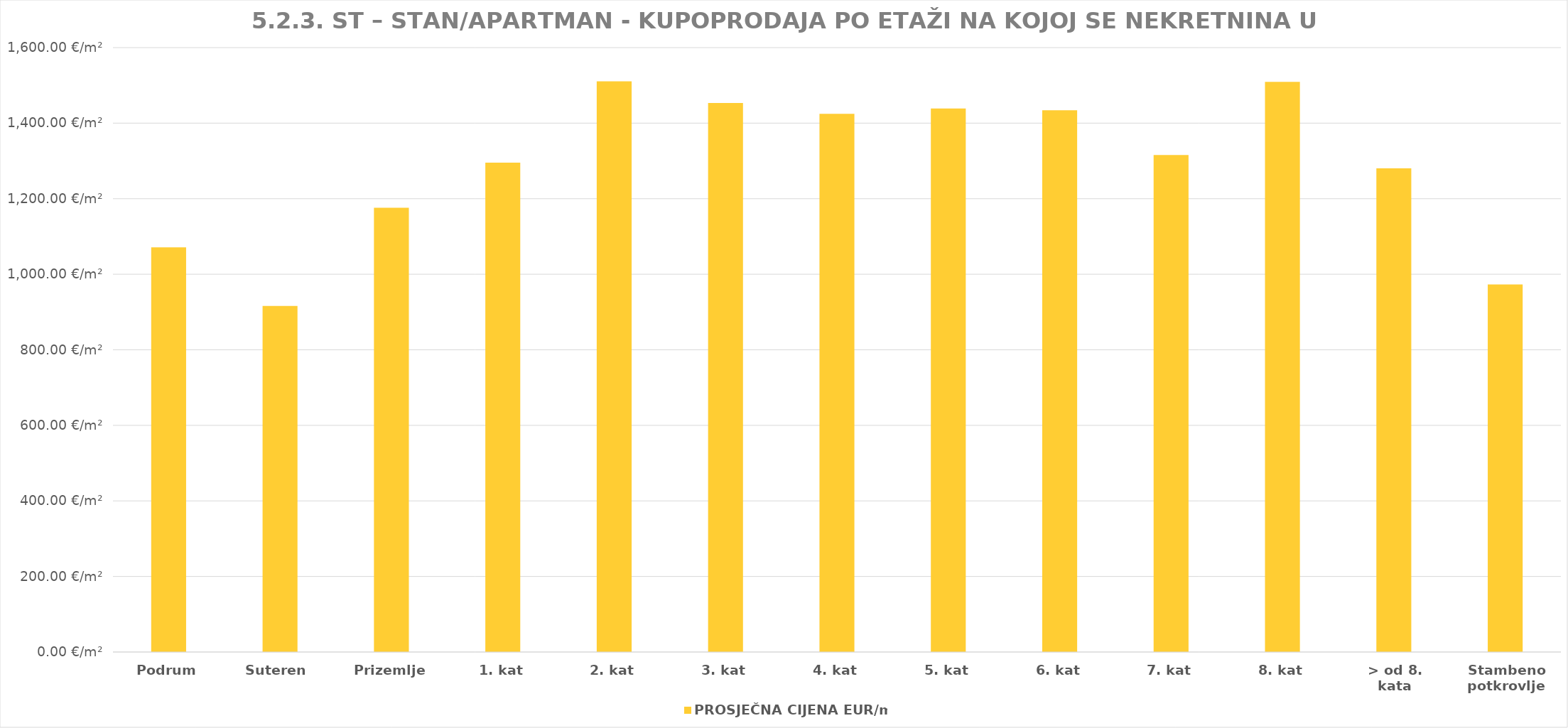
| Category | PROSJEČNA CIJENA EUR/m2 |
|---|---|
| Podrum | 1902-12-06 01:18:06 |
| Suteren  | 1902-07-04 05:12:31 |
| Prizemlje | 1903-03-21 01:20:58 |
| 1. kat | 1903-07-18 12:42:10 |
| 2. kat | 1904-02-18 18:46:46 |
| 3. kat | 1903-12-23 09:40:04 |
| 4. kat | 1903-11-24 17:52:17 |
| 5. kat | 1903-12-08 16:10:17 |
| 6. kat | 1903-12-03 22:10:48 |
| 7. kat | 1903-08-07 19:08:59 |
| 8. kat | 1904-02-17 03:30:01 |
| > od 8. kata | 1903-07-03 11:47:05 |
| Stambeno potkrovlje | 1902-08-30 01:11:16 |